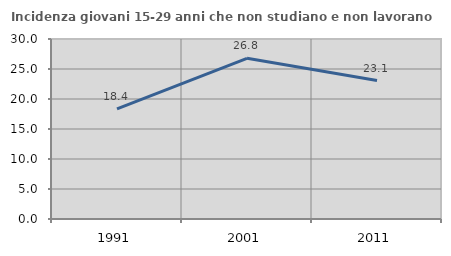
| Category | Incidenza giovani 15-29 anni che non studiano e non lavorano  |
|---|---|
| 1991.0 | 18.362 |
| 2001.0 | 26.781 |
| 2011.0 | 23.083 |